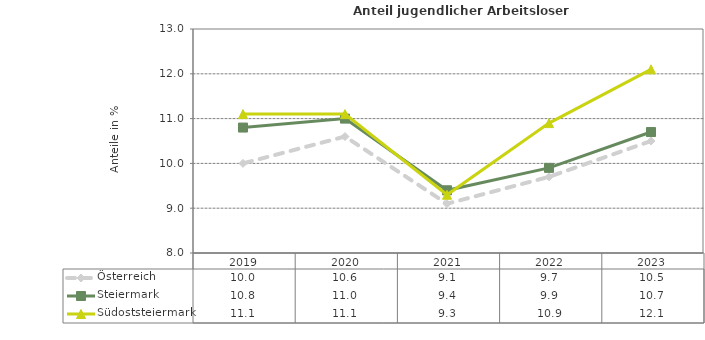
| Category | Österreich | Steiermark | Südoststeiermark |
|---|---|---|---|
| 2023.0 | 10.5 | 10.7 | 12.1 |
| 2022.0 | 9.7 | 9.9 | 10.9 |
| 2021.0 | 9.1 | 9.4 | 9.3 |
| 2020.0 | 10.6 | 11 | 11.1 |
| 2019.0 | 10 | 10.8 | 11.1 |